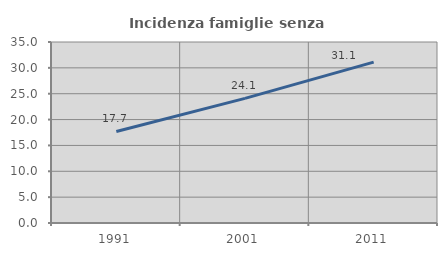
| Category | Incidenza famiglie senza nuclei |
|---|---|
| 1991.0 | 17.708 |
| 2001.0 | 24.095 |
| 2011.0 | 31.103 |